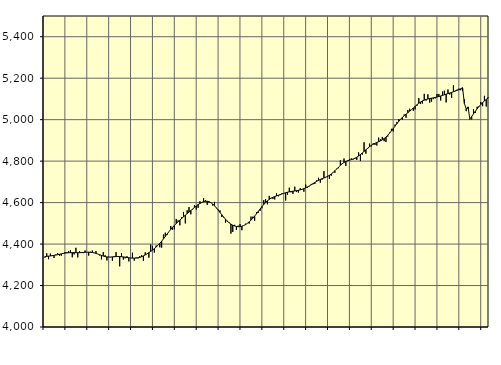
| Category | Piggar | Series 1 |
|---|---|---|
| nan | 4334.2 | 4339.69 |
| 1.0 | 4355.4 | 4340.64 |
| 1.0 | 4326.9 | 4341.66 |
| 1.0 | 4354.1 | 4342.77 |
| 1.0 | 4346.4 | 4343.97 |
| 1.0 | 4333.1 | 4345.29 |
| 1.0 | 4349.9 | 4347.05 |
| 1.0 | 4356.6 | 4348.73 |
| 1.0 | 4343.8 | 4350.78 |
| 1.0 | 4343.7 | 4352.78 |
| 1.0 | 4356.4 | 4354.63 |
| 1.0 | 4361.3 | 4356.15 |
| nan | 4360.5 | 4357.28 |
| 2.0 | 4365.7 | 4358.07 |
| 2.0 | 4371.5 | 4358.52 |
| 2.0 | 4336.2 | 4358.7 |
| 2.0 | 4349.8 | 4358.64 |
| 2.0 | 4382 | 4358.5 |
| 2.0 | 4335.7 | 4358.42 |
| 2.0 | 4366 | 4358.53 |
| 2.0 | 4361 | 4358.98 |
| 2.0 | 4356.2 | 4359.68 |
| 2.0 | 4369.2 | 4360.35 |
| 2.0 | 4361.3 | 4360.81 |
| nan | 4344.3 | 4360.84 |
| 3.0 | 4362.8 | 4360.28 |
| 3.0 | 4368.7 | 4359.13 |
| 3.0 | 4356.9 | 4357.38 |
| 3.0 | 4366.3 | 4355 |
| 3.0 | 4351.8 | 4352 |
| 3.0 | 4345 | 4348.61 |
| 3.0 | 4326.1 | 4345.21 |
| 3.0 | 4361.1 | 4342.1 |
| 3.0 | 4346.4 | 4339.65 |
| 3.0 | 4321 | 4338.04 |
| 3.0 | 4338.7 | 4337.37 |
| nan | 4336.6 | 4337.59 |
| 4.0 | 4319.8 | 4338.27 |
| 4.0 | 4342.5 | 4339.05 |
| 4.0 | 4361.2 | 4339.65 |
| 4.0 | 4338.8 | 4339.91 |
| 4.0 | 4292.6 | 4339.68 |
| 4.0 | 4356.1 | 4339.01 |
| 4.0 | 4325.3 | 4338.06 |
| 4.0 | 4331.2 | 4336.82 |
| 4.0 | 4341.5 | 4335.35 |
| 4.0 | 4316.5 | 4334.06 |
| 4.0 | 4332.6 | 4333.02 |
| nan | 4358.5 | 4332.24 |
| 5.0 | 4319.9 | 4332.03 |
| 5.0 | 4335.6 | 4332.52 |
| 5.0 | 4331.1 | 4333.72 |
| 5.0 | 4341.4 | 4335.78 |
| 5.0 | 4346.2 | 4338.94 |
| 5.0 | 4319.2 | 4342.96 |
| 5.0 | 4360.2 | 4347.56 |
| 5.0 | 4352.2 | 4352.71 |
| 5.0 | 4334.5 | 4358.34 |
| 5.0 | 4397.7 | 4364.35 |
| 5.0 | 4389.2 | 4370.87 |
| nan | 4359.3 | 4378.01 |
| 6.0 | 4393.1 | 4385.75 |
| 6.0 | 4393.9 | 4394.26 |
| 6.0 | 4384.5 | 4403.66 |
| 6.0 | 4382.9 | 4413.92 |
| 6.0 | 4446.1 | 4424.8 |
| 6.0 | 4455 | 4436.33 |
| 6.0 | 4444.4 | 4448.13 |
| 6.0 | 4459.9 | 4459.6 |
| 6.0 | 4487.4 | 4470.58 |
| 6.0 | 4469.2 | 4480.85 |
| 6.0 | 4471 | 4490.17 |
| nan | 4521.1 | 4498.87 |
| 7.0 | 4514.3 | 4507.31 |
| 7.0 | 4490.4 | 4515.5 |
| 7.0 | 4529.3 | 4523.61 |
| 7.0 | 4555 | 4531.63 |
| 7.0 | 4499.6 | 4539.42 |
| 7.0 | 4563 | 4546.91 |
| 7.0 | 4578.3 | 4554.3 |
| 7.0 | 4543.5 | 4561.73 |
| 7.0 | 4567 | 4569.19 |
| 7.0 | 4587.7 | 4576.52 |
| 7.0 | 4566.5 | 4583.65 |
| nan | 4574.8 | 4590.28 |
| 8.0 | 4606.3 | 4596.03 |
| 8.0 | 4602.5 | 4600.81 |
| 8.0 | 4621 | 4604.35 |
| 8.0 | 4612.4 | 4606.29 |
| 8.0 | 4589.3 | 4606.33 |
| 8.0 | 4600.1 | 4604.27 |
| 8.0 | 4600 | 4599.82 |
| 8.0 | 4585.8 | 4593.13 |
| 8.0 | 4603.3 | 4584.59 |
| 8.0 | 4573.1 | 4574.66 |
| 8.0 | 4565.7 | 4563.82 |
| nan | 4562.7 | 4552.57 |
| 9.0 | 4530.4 | 4541.34 |
| 9.0 | 4528.6 | 4530.44 |
| 9.0 | 4503 | 4520.19 |
| 9.0 | 4507.1 | 4510.88 |
| 9.0 | 4504.5 | 4502.85 |
| 9.0 | 4450.5 | 4496.2 |
| 9.0 | 4458.4 | 4490.91 |
| 9.0 | 4492.8 | 4487.11 |
| 9.0 | 4467.9 | 4484.73 |
| 9.0 | 4488.6 | 4483.73 |
| 9.0 | 4496.3 | 4484.2 |
| nan | 4466.8 | 4486.14 |
| 10.0 | 4489.2 | 4489.42 |
| 10.0 | 4498.1 | 4493.98 |
| 10.0 | 4500.3 | 4499.88 |
| 10.0 | 4498.6 | 4507.02 |
| 10.0 | 4532.6 | 4515.27 |
| 10.0 | 4532.1 | 4524.61 |
| 10.0 | 4512.4 | 4534.98 |
| 10.0 | 4554 | 4546.05 |
| 10.0 | 4550.7 | 4557.57 |
| 10.0 | 4560.2 | 4569.18 |
| 10.0 | 4572.7 | 4580.4 |
| nan | 4612 | 4590.89 |
| 11.0 | 4617.2 | 4600.41 |
| 11.0 | 4592 | 4608.72 |
| 11.0 | 4632.4 | 4615.62 |
| 11.0 | 4623.1 | 4621.19 |
| 11.0 | 4617.2 | 4625.68 |
| 11.0 | 4615.3 | 4629.26 |
| 11.0 | 4644.9 | 4632.39 |
| 11.0 | 4630.3 | 4635.45 |
| 11.0 | 4636 | 4638.49 |
| 11.0 | 4644.2 | 4641.61 |
| 11.0 | 4645.3 | 4644.75 |
| nan | 4610.2 | 4647.58 |
| 12.0 | 4638.2 | 4649.97 |
| 12.0 | 4671.8 | 4651.94 |
| 12.0 | 4649.7 | 4653.57 |
| 12.0 | 4641.9 | 4654.9 |
| 12.0 | 4676.6 | 4656.22 |
| 12.0 | 4650.9 | 4657.71 |
| 12.0 | 4648.6 | 4659.41 |
| 12.0 | 4669.2 | 4661.51 |
| 12.0 | 4662.9 | 4664.23 |
| 12.0 | 4652.6 | 4667.47 |
| 12.0 | 4686.9 | 4671.22 |
| nan | 4671.8 | 4675.55 |
| 13.0 | 4678.6 | 4680.49 |
| 13.0 | 4690.1 | 4685.94 |
| 13.0 | 4688.2 | 4691.57 |
| 13.0 | 4689.7 | 4697.22 |
| 13.0 | 4707.4 | 4702.58 |
| 13.0 | 4719.9 | 4707.42 |
| 13.0 | 4696 | 4711.69 |
| 13.0 | 4710.3 | 4715.44 |
| 13.0 | 4751.7 | 4718.85 |
| 13.0 | 4723.7 | 4722.47 |
| 13.0 | 4722.7 | 4726.73 |
| nan | 4713.8 | 4731.85 |
| 14.0 | 4729.5 | 4738.04 |
| 14.0 | 4746.4 | 4745.3 |
| 14.0 | 4744.1 | 4753.48 |
| 14.0 | 4763.7 | 4762.31 |
| 14.0 | 4765.9 | 4771.2 |
| 14.0 | 4804 | 4779.71 |
| 14.0 | 4789.5 | 4787.42 |
| 14.0 | 4812.4 | 4793.77 |
| 14.0 | 4776.7 | 4798.57 |
| 14.0 | 4799.9 | 4802.05 |
| 14.0 | 4810.7 | 4804.74 |
| nan | 4813.3 | 4807.28 |
| 15.0 | 4807.7 | 4810.23 |
| 15.0 | 4811.1 | 4814.02 |
| 15.0 | 4806.2 | 4818.98 |
| 15.0 | 4842.3 | 4825.04 |
| 15.0 | 4800.3 | 4831.94 |
| 15.0 | 4831.1 | 4839.31 |
| 15.0 | 4890.7 | 4846.89 |
| 15.0 | 4835.7 | 4854.63 |
| 15.0 | 4860.4 | 4862.27 |
| 15.0 | 4884.2 | 4869.51 |
| 15.0 | 4871.2 | 4875.89 |
| nan | 4886.1 | 4881.33 |
| 16.0 | 4878.3 | 4885.95 |
| 16.0 | 4875.3 | 4889.99 |
| 16.0 | 4913.3 | 4893.83 |
| 16.0 | 4905.1 | 4897.94 |
| 16.0 | 4916.8 | 4902.83 |
| 16.0 | 4896.3 | 4908.93 |
| 16.0 | 4892.3 | 4916.32 |
| 16.0 | 4918.4 | 4924.96 |
| 16.0 | 4937.7 | 4934.85 |
| 16.0 | 4955.9 | 4945.65 |
| 16.0 | 4943.1 | 4957.08 |
| nan | 4976.5 | 4968.91 |
| 17.0 | 4989 | 4980.67 |
| 17.0 | 5002.6 | 4991.81 |
| 17.0 | 5002.4 | 5001.96 |
| 17.0 | 5000.4 | 5011.02 |
| 17.0 | 5025.2 | 5019.05 |
| 17.0 | 5009.2 | 5026.44 |
| 17.0 | 5046.1 | 5033.57 |
| 17.0 | 5052.7 | 5040.82 |
| 17.0 | 5048.3 | 5048.37 |
| 17.0 | 5042.7 | 5056.23 |
| 17.0 | 5049.9 | 5064.24 |
| nan | 5067.2 | 5072.01 |
| 18.0 | 5104.1 | 5079.03 |
| 18.0 | 5076.2 | 5085.17 |
| 18.0 | 5078 | 5090.26 |
| 18.0 | 5124.6 | 5094.24 |
| 18.0 | 5091.9 | 5097.43 |
| 18.0 | 5122.4 | 5099.89 |
| 18.0 | 5082.4 | 5101.85 |
| 18.0 | 5087 | 5103.59 |
| 18.0 | 5099.2 | 5105.27 |
| 18.0 | 5102.4 | 5107.11 |
| 18.0 | 5123.5 | 5109.24 |
| nan | 5124 | 5111.64 |
| 19.0 | 5092.3 | 5114.27 |
| 19.0 | 5135.6 | 5117.11 |
| 19.0 | 5139.6 | 5120.09 |
| 19.0 | 5083.1 | 5123.03 |
| 19.0 | 5145.6 | 5125.84 |
| 19.0 | 5121.5 | 5128.65 |
| 19.0 | 5105.4 | 5131.57 |
| 19.0 | 5165.7 | 5134.64 |
| 19.0 | 5140.2 | 5137.86 |
| 19.0 | 5145.3 | 5141.21 |
| 19.0 | 5149.7 | 5144.83 |
| nan | 5141.9 | 5148.94 |
| 20.0 | 5137.6 | 5154.03 |
| 20.0 | 5097.9 | 5077.98 |
| 20.0 | 5040.9 | 5052.2 |
| 20.0 | 5051.4 | 5061.68 |
| 20.0 | 5000.5 | 5003.58 |
| 20.0 | 5001.5 | 5015.52 |
| 20.0 | 5051.3 | 5028.04 |
| 20.0 | 5033.1 | 5040.48 |
| 20.0 | 5062.5 | 5052.28 |
| 20.0 | 5065.8 | 5063.26 |
| 20.0 | 5085.3 | 5073.24 |
| nan | 5065 | 5082.22 |
| 21.0 | 5114.9 | 5090.31 |
| 21.0 | 5063.4 | 5097.6 |
| 21.0 | 5107.4 | 5104.25 |